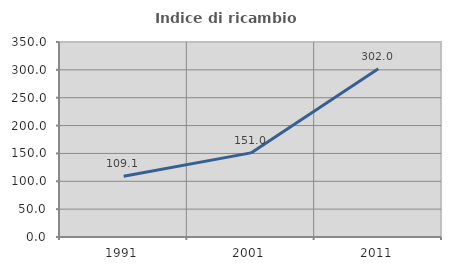
| Category | Indice di ricambio occupazionale  |
|---|---|
| 1991.0 | 109.081 |
| 2001.0 | 150.982 |
| 2011.0 | 302.019 |